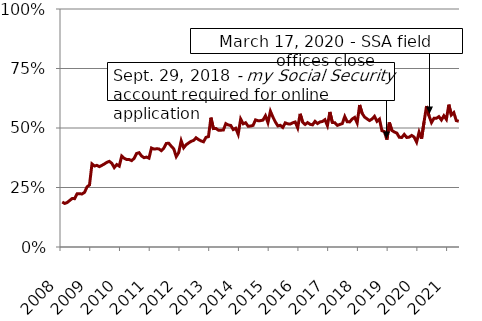
| Category | Series 1 |
|---|---|
| 2008.0 | 0.189 |
| 2008.0 | 0.183 |
| 2008.0 | 0.187 |
| 2008.0 | 0.195 |
| 2008.0 | 0.204 |
| 2008.0 | 0.203 |
| 2008.0 | 0.224 |
| 2008.0 | 0.224 |
| 2008.0 | 0.223 |
| 2008.0 | 0.23 |
| 2008.0 | 0.253 |
| 2008.0 | 0.261 |
| 2009.0 | 0.349 |
| 2009.0 | 0.34 |
| 2009.0 | 0.343 |
| 2009.0 | 0.338 |
| 2009.0 | 0.343 |
| 2009.0 | 0.349 |
| 2009.0 | 0.356 |
| 2009.0 | 0.36 |
| 2009.0 | 0.352 |
| 2009.0 | 0.334 |
| 2009.0 | 0.346 |
| 2009.0 | 0.34 |
| 2010.0 | 0.382 |
| 2010.0 | 0.373 |
| 2010.0 | 0.368 |
| 2010.0 | 0.368 |
| 2010.0 | 0.363 |
| 2010.0 | 0.372 |
| 2010.0 | 0.393 |
| 2010.0 | 0.396 |
| 2010.0 | 0.383 |
| 2010.0 | 0.375 |
| 2010.0 | 0.378 |
| 2010.0 | 0.373 |
| 2011.0 | 0.416 |
| 2011.0 | 0.411 |
| 2011.0 | 0.413 |
| 2011.0 | 0.412 |
| 2011.0 | 0.405 |
| 2011.0 | 0.416 |
| 2011.0 | 0.435 |
| 2011.0 | 0.436 |
| 2011.0 | 0.423 |
| 2011.0 | 0.412 |
| 2011.0 | 0.38 |
| 2011.0 | 0.397 |
| 2012.0 | 0.446 |
| 2012.0 | 0.417 |
| 2012.0 | 0.43 |
| 2012.0 | 0.437 |
| 2012.0 | 0.444 |
| 2012.0 | 0.448 |
| 2012.0 | 0.459 |
| 2012.0 | 0.451 |
| 2012.0 | 0.446 |
| 2012.0 | 0.442 |
| 2012.0 | 0.461 |
| 2012.0 | 0.464 |
| 2013.0 | 0.543 |
| 2013.0 | 0.498 |
| 2013.0 | 0.498 |
| 2013.0 | 0.491 |
| 2013.0 | 0.491 |
| 2013.0 | 0.491 |
| 2013.0 | 0.518 |
| 2013.0 | 0.513 |
| 2013.0 | 0.511 |
| 2013.0 | 0.493 |
| 2013.0 | 0.499 |
| 2013.0 | 0.474 |
| 2014.0 | 0.538 |
| 2014.0 | 0.518 |
| 2014.0 | 0.522 |
| 2014.0 | 0.507 |
| 2014.0 | 0.508 |
| 2014.0 | 0.511 |
| 2014.0 | 0.534 |
| 2014.0 | 0.53 |
| 2014.0 | 0.531 |
| 2014.0 | 0.533 |
| 2014.0 | 0.551 |
| 2014.0 | 0.522 |
| 2015.0 | 0.57 |
| 2015.0 | 0.546 |
| 2015.0 | 0.525 |
| 2015.0 | 0.509 |
| 2015.0 | 0.511 |
| 2015.0 | 0.502 |
| 2015.0 | 0.522 |
| 2015.0 | 0.518 |
| 2015.0 | 0.517 |
| 2015.0 | 0.522 |
| 2015.0 | 0.525 |
| 2015.0 | 0.501 |
| 2016.0 | 0.56 |
| 2016.0 | 0.525 |
| 2016.0 | 0.515 |
| 2016.0 | 0.523 |
| 2016.0 | 0.516 |
| 2016.0 | 0.513 |
| 2016.0 | 0.528 |
| 2016.0 | 0.519 |
| 2016.0 | 0.525 |
| 2016.0 | 0.528 |
| 2016.0 | 0.535 |
| 2016.0 | 0.51 |
| 2017.0 | 0.568 |
| 2017.0 | 0.523 |
| 2017.0 | 0.522 |
| 2017.0 | 0.511 |
| 2017.0 | 0.515 |
| 2017.0 | 0.518 |
| 2017.0 | 0.548 |
| 2017.0 | 0.526 |
| 2017.0 | 0.526 |
| 2017.0 | 0.538 |
| 2017.0 | 0.544 |
| 2017.0 | 0.521 |
| 2018.0 | 0.597 |
| 2018.0 | 0.562 |
| 2018.0 | 0.546 |
| 2018.0 | 0.538 |
| 2018.0 | 0.531 |
| 2018.0 | 0.538 |
| 2018.0 | 0.549 |
| 2018.0 | 0.528 |
| 2018.0 | 0.537 |
| 2018.0 | 0.489 |
| 2018.0 | 0.485 |
| 2018.0 | 0.451 |
| 2019.0 | 0.523 |
| 2019.0 | 0.49 |
| 2019.0 | 0.483 |
| 2019.0 | 0.479 |
| 2019.0 | 0.461 |
| 2019.0 | 0.46 |
| 2019.0 | 0.473 |
| 2019.0 | 0.46 |
| 2019.0 | 0.462 |
| 2019.0 | 0.469 |
| 2019.0 | 0.462 |
| 2019.0 | 0.441 |
| 2020.0 | 0.483 |
| 2020.0 | 0.455 |
| 2020.0 | 0.526 |
| 2020.0 | 0.592 |
| 2020.0 | 0.551 |
| 2020.0 | 0.523 |
| 2020.0 | 0.541 |
| 2020.0 | 0.541 |
| 2020.0 | 0.548 |
| 2020.0 | 0.534 |
| 2020.0 | 0.552 |
| 2020.0 | 0.536 |
| 2021.0 | 0.598 |
| 2021.0 | 0.555 |
| 2021.0 | 0.565 |
| 2021.0 | 0.531 |
| 2021.0 | 0.528 |